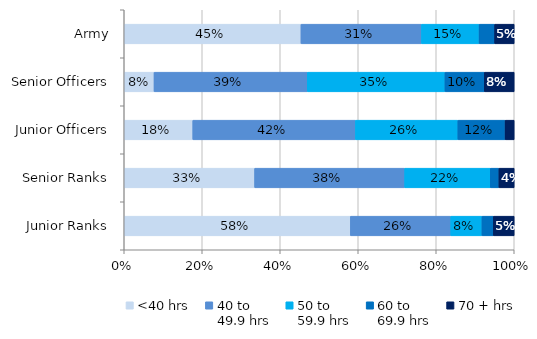
| Category | <40 hrs | 40 to 
49.9 hrs | 50 to 
59.9 hrs | 60 to 
69.9 hrs | 70 + hrs |
|---|---|---|---|---|---|
| Army | 0.453 | 0.309 | 0.148 | 0.04 | 0.05 |
| Senior Officers | 0.076 | 0.393 | 0.353 | 0.101 | 0.077 |
| Junior Officers | 0.176 | 0.417 | 0.263 | 0.121 | 0.023 |
| Senior Ranks | 0.334 | 0.385 | 0.219 | 0.022 | 0.039 |
| Junior Ranks | 0.58 | 0.257 | 0.08 | 0.029 | 0.054 |